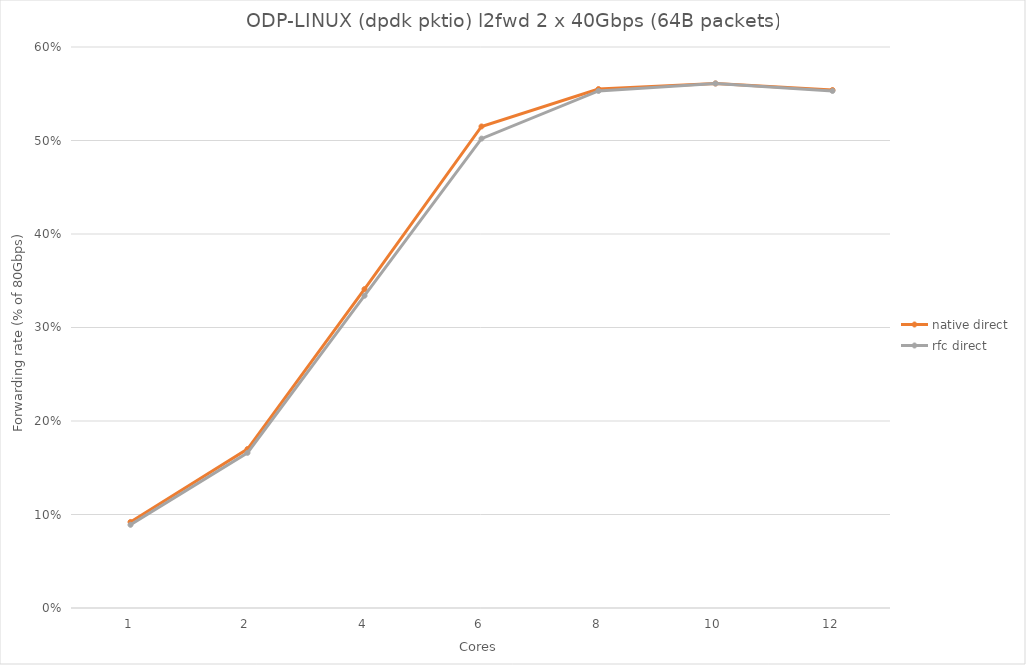
| Category | native direct | rfc direct |
|---|---|---|
| 1.0 | 0.092 | 0.089 |
| 2.0 | 0.17 | 0.166 |
| 4.0 | 0.341 | 0.334 |
| 6.0 | 0.515 | 0.502 |
| 8.0 | 0.555 | 0.553 |
| 10.0 | 0.561 | 0.561 |
| 12.0 | 0.554 | 0.553 |